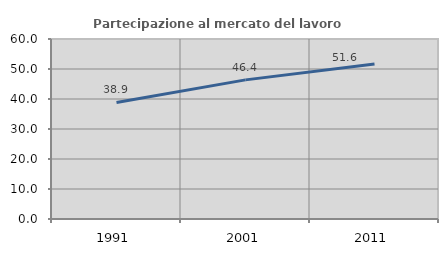
| Category | Partecipazione al mercato del lavoro  femminile |
|---|---|
| 1991.0 | 38.851 |
| 2001.0 | 46.372 |
| 2011.0 | 51.646 |